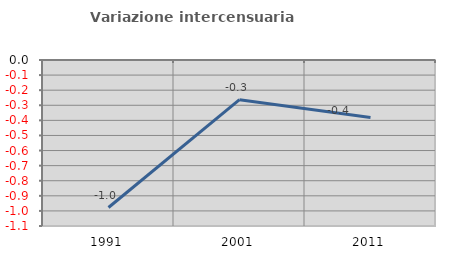
| Category | Variazione intercensuaria annua |
|---|---|
| 1991.0 | -0.978 |
| 2001.0 | -0.263 |
| 2011.0 | -0.381 |